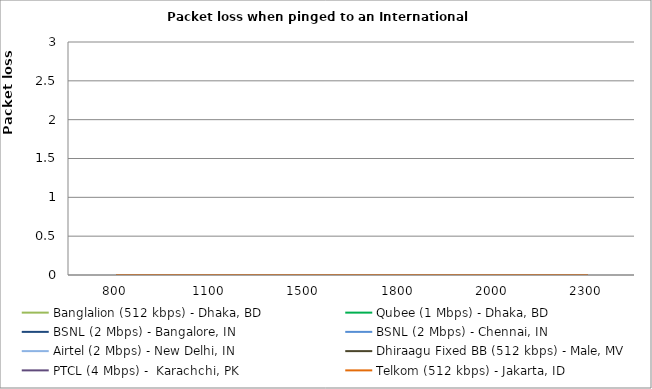
| Category | Banglalion (512 kbps) - Dhaka, BD | Qubee (1 Mbps) - Dhaka, BD | BSNL (2 Mbps) - Bangalore, IN | BSNL (2 Mbps) - Chennai, IN | Airtel (2 Mbps) - New Delhi, IN | Dhiraagu Fixed BB (512 kbps) - Male, MV | PTCL (4 Mbps) -  Karachchi, PK | Telkom (512 kbps) - Jakarta, ID |
|---|---|---|---|---|---|---|---|---|
| 800.0 | 0 | 0 | 0 | 0 | 0 | 0 | 0 | 0 |
| 1100.0 | 0 | 0 | 0 | 0 | 0 | 0 | 0 | 0 |
| 1500.0 | 0 | 0 | 0 | 0 | 0 | 0 | 0 | 0 |
| 1800.0 | 0 | 0 | 0 | 0 | 0 | 0 | 0 | 0 |
| 2000.0 | 0 | 0 | 0 | 0 | 0 | 0 | 0 | 0 |
| 2300.0 | 0 | 0 | 0 | 0 | 0 | 0 | 0 | 0 |